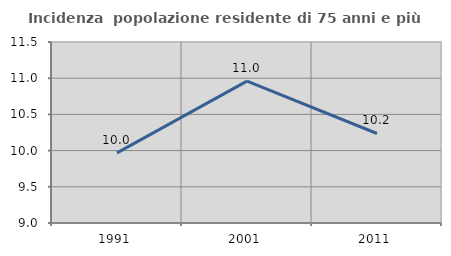
| Category | Incidenza  popolazione residente di 75 anni e più |
|---|---|
| 1991.0 | 9.968 |
| 2001.0 | 10.959 |
| 2011.0 | 10.236 |